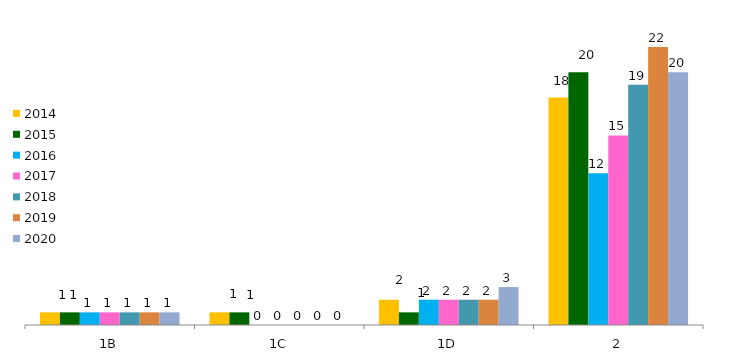
| Category | 2014 | 2015 | 2016 | 2017 | 2018 | 2019 | 2020 |
|---|---|---|---|---|---|---|---|
| 1B | 1 | 1 | 1 | 1 | 1 | 1 | 1 |
| 1C | 1 | 1 | 0 | 0 | 0 | 0 | 0 |
| 1D | 2 | 1 | 2 | 2 | 2 | 2 | 3 |
| 2 | 18 | 20 | 12 | 15 | 19 | 22 | 20 |